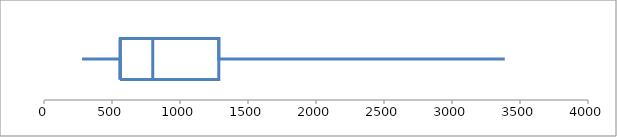
| Category | Series 0 |
|---|---|
| 280.0 | 1 |
| 560.0 | 1 |
| 560.0 | 0.5 |
| 560.0 | 1.5 |
| 800.5 | 1.5 |
| 800.5 | 0.5 |
| 560.0 | 0.5 |
| 1285.25 | 0.5 |
| 1285.25 | 1.5 |
| 800.5 | 1.5 |
| 1285.25 | 1.5 |
| 1285.25 | 1 |
| 3388.0 | 1 |